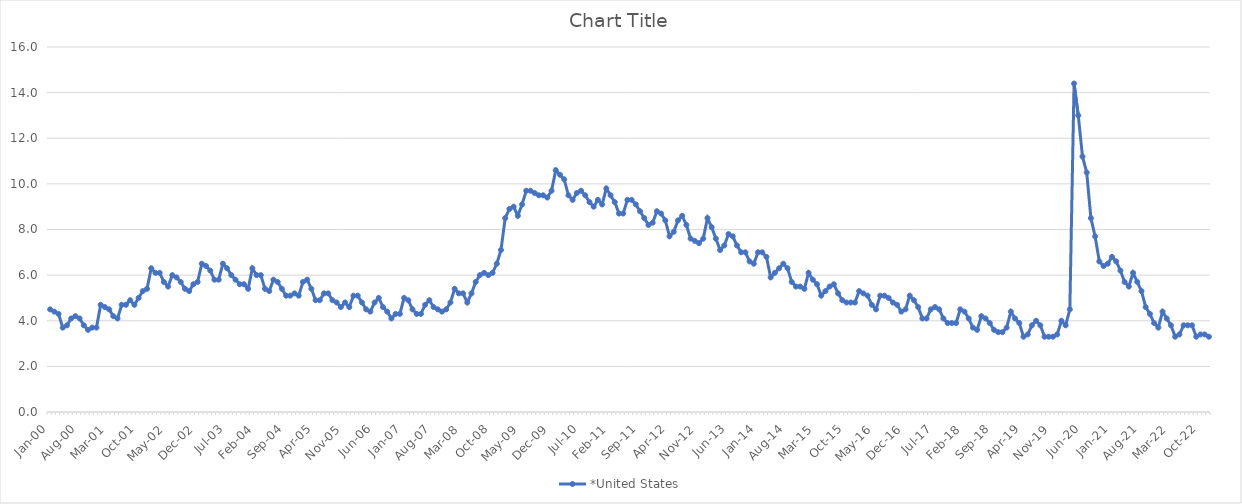
| Category | *United States | Alaska | Alabama | Arkansas | Arizona | California | Colorado | Connecticut | Delaware | Florida | Georgia | Hawaii | Iowa | Idaho | Illinois | Indiana | Kansas | Kentucky | Louisiana | Massachusetts | Maryland | Maine | Michigan | Minnesota | Missouri | Mississippi | Montana | North Carolina | North Dakota | Nebraska | New Hampshire | New Jersey | New Mexico | Nevada | New York | Ohio | Oklahoma | Oregon | Pennsylvania | Rhode Island | South Carolina | South Dakota | Tennessee | Texas | Utah | Virginia | Vermont | Washington | Wisconsin | West Virginia | Wyoming |
|---|---|---|---|---|---|---|---|---|---|---|---|---|---|---|---|---|---|---|---|---|---|---|---|---|---|---|---|---|---|---|---|---|---|---|---|---|---|---|---|---|---|---|---|---|---|---|---|---|---|---|---|
| Jan-00 | 4.5 |  |  |  |  |  |  |  |  |  |  |  |  |  |  |  |  |  |  |  |  |  |  |  |  |  |  |  |  |  |  |  |  |  |  |  |  |  |  |  |  |  |  |  |  |  |  |  |  |  |  |
| Feb-00 | 4.4 |  |  |  |  |  |  |  |  |  |  |  |  |  |  |  |  |  |  |  |  |  |  |  |  |  |  |  |  |  |  |  |  |  |  |  |  |  |  |  |  |  |  |  |  |  |  |  |  |  |  |
| Mar-00 | 4.3 |  |  |  |  |  |  |  |  |  |  |  |  |  |  |  |  |  |  |  |  |  |  |  |  |  |  |  |  |  |  |  |  |  |  |  |  |  |  |  |  |  |  |  |  |  |  |  |  |  |  |
| Apr-00 | 3.7 |  |  |  |  |  |  |  |  |  |  |  |  |  |  |  |  |  |  |  |  |  |  |  |  |  |  |  |  |  |  |  |  |  |  |  |  |  |  |  |  |  |  |  |  |  |  |  |  |  |  |
| May-00 | 3.8 |  |  |  |  |  |  |  |  |  |  |  |  |  |  |  |  |  |  |  |  |  |  |  |  |  |  |  |  |  |  |  |  |  |  |  |  |  |  |  |  |  |  |  |  |  |  |  |  |  |  |
| Jun-00 | 4.1 |  |  |  |  |  |  |  |  |  |  |  |  |  |  |  |  |  |  |  |  |  |  |  |  |  |  |  |  |  |  |  |  |  |  |  |  |  |  |  |  |  |  |  |  |  |  |  |  |  |  |
| Jul-00 | 4.2 |  |  |  |  |  |  |  |  |  |  |  |  |  |  |  |  |  |  |  |  |  |  |  |  |  |  |  |  |  |  |  |  |  |  |  |  |  |  |  |  |  |  |  |  |  |  |  |  |  |  |
| Aug-00 | 4.1 |  |  |  |  |  |  |  |  |  |  |  |  |  |  |  |  |  |  |  |  |  |  |  |  |  |  |  |  |  |  |  |  |  |  |  |  |  |  |  |  |  |  |  |  |  |  |  |  |  |  |
| Sep-00 | 3.8 |  |  |  |  |  |  |  |  |  |  |  |  |  |  |  |  |  |  |  |  |  |  |  |  |  |  |  |  |  |  |  |  |  |  |  |  |  |  |  |  |  |  |  |  |  |  |  |  |  |  |
| Oct-00 | 3.6 |  |  |  |  |  |  |  |  |  |  |  |  |  |  |  |  |  |  |  |  |  |  |  |  |  |  |  |  |  |  |  |  |  |  |  |  |  |  |  |  |  |  |  |  |  |  |  |  |  |  |
| Nov-00 | 3.7 |  |  |  |  |  |  |  |  |  |  |  |  |  |  |  |  |  |  |  |  |  |  |  |  |  |  |  |  |  |  |  |  |  |  |  |  |  |  |  |  |  |  |  |  |  |  |  |  |  |  |
| Dec-00 | 3.7 |  |  |  |  |  |  |  |  |  |  |  |  |  |  |  |  |  |  |  |  |  |  |  |  |  |  |  |  |  |  |  |  |  |  |  |  |  |  |  |  |  |  |  |  |  |  |  |  |  |  |
| Jan-01 | 4.7 |  |  |  |  |  |  |  |  |  |  |  |  |  |  |  |  |  |  |  |  |  |  |  |  |  |  |  |  |  |  |  |  |  |  |  |  |  |  |  |  |  |  |  |  |  |  |  |  |  |  |
| Feb-01 | 4.6 |  |  |  |  |  |  |  |  |  |  |  |  |  |  |  |  |  |  |  |  |  |  |  |  |  |  |  |  |  |  |  |  |  |  |  |  |  |  |  |  |  |  |  |  |  |  |  |  |  |  |
| Mar-01 | 4.5 |  |  |  |  |  |  |  |  |  |  |  |  |  |  |  |  |  |  |  |  |  |  |  |  |  |  |  |  |  |  |  |  |  |  |  |  |  |  |  |  |  |  |  |  |  |  |  |  |  |  |
| Apr-01 | 4.2 |  |  |  |  |  |  |  |  |  |  |  |  |  |  |  |  |  |  |  |  |  |  |  |  |  |  |  |  |  |  |  |  |  |  |  |  |  |  |  |  |  |  |  |  |  |  |  |  |  |  |
| May-01 | 4.1 |  |  |  |  |  |  |  |  |  |  |  |  |  |  |  |  |  |  |  |  |  |  |  |  |  |  |  |  |  |  |  |  |  |  |  |  |  |  |  |  |  |  |  |  |  |  |  |  |  |  |
| Jun-01 | 4.7 |  |  |  |  |  |  |  |  |  |  |  |  |  |  |  |  |  |  |  |  |  |  |  |  |  |  |  |  |  |  |  |  |  |  |  |  |  |  |  |  |  |  |  |  |  |  |  |  |  |  |
| Jul-01 | 4.7 |  |  |  |  |  |  |  |  |  |  |  |  |  |  |  |  |  |  |  |  |  |  |  |  |  |  |  |  |  |  |  |  |  |  |  |  |  |  |  |  |  |  |  |  |  |  |  |  |  |  |
| Aug-01 | 4.9 |  |  |  |  |  |  |  |  |  |  |  |  |  |  |  |  |  |  |  |  |  |  |  |  |  |  |  |  |  |  |  |  |  |  |  |  |  |  |  |  |  |  |  |  |  |  |  |  |  |  |
| Sep-01 | 4.7 |  |  |  |  |  |  |  |  |  |  |  |  |  |  |  |  |  |  |  |  |  |  |  |  |  |  |  |  |  |  |  |  |  |  |  |  |  |  |  |  |  |  |  |  |  |  |  |  |  |  |
| Oct-01 | 5 |  |  |  |  |  |  |  |  |  |  |  |  |  |  |  |  |  |  |  |  |  |  |  |  |  |  |  |  |  |  |  |  |  |  |  |  |  |  |  |  |  |  |  |  |  |  |  |  |  |  |
| Nov-01 | 5.3 |  |  |  |  |  |  |  |  |  |  |  |  |  |  |  |  |  |  |  |  |  |  |  |  |  |  |  |  |  |  |  |  |  |  |  |  |  |  |  |  |  |  |  |  |  |  |  |  |  |  |
| Dec-01 | 5.4 |  |  |  |  |  |  |  |  |  |  |  |  |  |  |  |  |  |  |  |  |  |  |  |  |  |  |  |  |  |  |  |  |  |  |  |  |  |  |  |  |  |  |  |  |  |  |  |  |  |  |
| Jan-02 | 6.3 |  |  |  |  |  |  |  |  |  |  |  |  |  |  |  |  |  |  |  |  |  |  |  |  |  |  |  |  |  |  |  |  |  |  |  |  |  |  |  |  |  |  |  |  |  |  |  |  |  |  |
| Feb-02 | 6.1 |  |  |  |  |  |  |  |  |  |  |  |  |  |  |  |  |  |  |  |  |  |  |  |  |  |  |  |  |  |  |  |  |  |  |  |  |  |  |  |  |  |  |  |  |  |  |  |  |  |  |
| Mar-02 | 6.1 |  |  |  |  |  |  |  |  |  |  |  |  |  |  |  |  |  |  |  |  |  |  |  |  |  |  |  |  |  |  |  |  |  |  |  |  |  |  |  |  |  |  |  |  |  |  |  |  |  |  |
| Apr-02 | 5.7 |  |  |  |  |  |  |  |  |  |  |  |  |  |  |  |  |  |  |  |  |  |  |  |  |  |  |  |  |  |  |  |  |  |  |  |  |  |  |  |  |  |  |  |  |  |  |  |  |  |  |
| May-02 | 5.5 |  |  |  |  |  |  |  |  |  |  |  |  |  |  |  |  |  |  |  |  |  |  |  |  |  |  |  |  |  |  |  |  |  |  |  |  |  |  |  |  |  |  |  |  |  |  |  |  |  |  |
| Jun-02 | 6 |  |  |  |  |  |  |  |  |  |  |  |  |  |  |  |  |  |  |  |  |  |  |  |  |  |  |  |  |  |  |  |  |  |  |  |  |  |  |  |  |  |  |  |  |  |  |  |  |  |  |
| Jul-02 | 5.9 |  |  |  |  |  |  |  |  |  |  |  |  |  |  |  |  |  |  |  |  |  |  |  |  |  |  |  |  |  |  |  |  |  |  |  |  |  |  |  |  |  |  |  |  |  |  |  |  |  |  |
| Aug-02 | 5.7 |  |  |  |  |  |  |  |  |  |  |  |  |  |  |  |  |  |  |  |  |  |  |  |  |  |  |  |  |  |  |  |  |  |  |  |  |  |  |  |  |  |  |  |  |  |  |  |  |  |  |
| Sep-02 | 5.4 |  |  |  |  |  |  |  |  |  |  |  |  |  |  |  |  |  |  |  |  |  |  |  |  |  |  |  |  |  |  |  |  |  |  |  |  |  |  |  |  |  |  |  |  |  |  |  |  |  |  |
| Oct-02 | 5.3 |  |  |  |  |  |  |  |  |  |  |  |  |  |  |  |  |  |  |  |  |  |  |  |  |  |  |  |  |  |  |  |  |  |  |  |  |  |  |  |  |  |  |  |  |  |  |  |  |  |  |
| Nov-02 | 5.6 |  |  |  |  |  |  |  |  |  |  |  |  |  |  |  |  |  |  |  |  |  |  |  |  |  |  |  |  |  |  |  |  |  |  |  |  |  |  |  |  |  |  |  |  |  |  |  |  |  |  |
| Dec-02 | 5.7 |  |  |  |  |  |  |  |  |  |  |  |  |  |  |  |  |  |  |  |  |  |  |  |  |  |  |  |  |  |  |  |  |  |  |  |  |  |  |  |  |  |  |  |  |  |  |  |  |  |  |
| Jan-03 | 6.5 |  |  |  |  |  |  |  |  |  |  |  |  |  |  |  |  |  |  |  |  |  |  |  |  |  |  |  |  |  |  |  |  |  |  |  |  |  |  |  |  |  |  |  |  |  |  |  |  |  |  |
| Feb-03 | 6.4 |  |  |  |  |  |  |  |  |  |  |  |  |  |  |  |  |  |  |  |  |  |  |  |  |  |  |  |  |  |  |  |  |  |  |  |  |  |  |  |  |  |  |  |  |  |  |  |  |  |  |
| Mar-03 | 6.2 |  |  |  |  |  |  |  |  |  |  |  |  |  |  |  |  |  |  |  |  |  |  |  |  |  |  |  |  |  |  |  |  |  |  |  |  |  |  |  |  |  |  |  |  |  |  |  |  |  |  |
| Apr-03 | 5.8 |  |  |  |  |  |  |  |  |  |  |  |  |  |  |  |  |  |  |  |  |  |  |  |  |  |  |  |  |  |  |  |  |  |  |  |  |  |  |  |  |  |  |  |  |  |  |  |  |  |  |
| May-03 | 5.8 |  |  |  |  |  |  |  |  |  |  |  |  |  |  |  |  |  |  |  |  |  |  |  |  |  |  |  |  |  |  |  |  |  |  |  |  |  |  |  |  |  |  |  |  |  |  |  |  |  |  |
| Jun-03 | 6.5 |  |  |  |  |  |  |  |  |  |  |  |  |  |  |  |  |  |  |  |  |  |  |  |  |  |  |  |  |  |  |  |  |  |  |  |  |  |  |  |  |  |  |  |  |  |  |  |  |  |  |
| Jul-03 | 6.3 |  |  |  |  |  |  |  |  |  |  |  |  |  |  |  |  |  |  |  |  |  |  |  |  |  |  |  |  |  |  |  |  |  |  |  |  |  |  |  |  |  |  |  |  |  |  |  |  |  |  |
| Aug-03 | 6 |  |  |  |  |  |  |  |  |  |  |  |  |  |  |  |  |  |  |  |  |  |  |  |  |  |  |  |  |  |  |  |  |  |  |  |  |  |  |  |  |  |  |  |  |  |  |  |  |  |  |
| Sep-03 | 5.8 |  |  |  |  |  |  |  |  |  |  |  |  |  |  |  |  |  |  |  |  |  |  |  |  |  |  |  |  |  |  |  |  |  |  |  |  |  |  |  |  |  |  |  |  |  |  |  |  |  |  |
| Oct-03 | 5.6 |  |  |  |  |  |  |  |  |  |  |  |  |  |  |  |  |  |  |  |  |  |  |  |  |  |  |  |  |  |  |  |  |  |  |  |  |  |  |  |  |  |  |  |  |  |  |  |  |  |  |
| Nov-03 | 5.6 |  |  |  |  |  |  |  |  |  |  |  |  |  |  |  |  |  |  |  |  |  |  |  |  |  |  |  |  |  |  |  |  |  |  |  |  |  |  |  |  |  |  |  |  |  |  |  |  |  |  |
| Dec-03 | 5.4 |  |  |  |  |  |  |  |  |  |  |  |  |  |  |  |  |  |  |  |  |  |  |  |  |  |  |  |  |  |  |  |  |  |  |  |  |  |  |  |  |  |  |  |  |  |  |  |  |  |  |
| Jan-04 | 6.3 |  |  |  |  |  |  |  |  |  |  |  |  |  |  |  |  |  |  |  |  |  |  |  |  |  |  |  |  |  |  |  |  |  |  |  |  |  |  |  |  |  |  |  |  |  |  |  |  |  |  |
| Feb-04 | 6 |  |  |  |  |  |  |  |  |  |  |  |  |  |  |  |  |  |  |  |  |  |  |  |  |  |  |  |  |  |  |  |  |  |  |  |  |  |  |  |  |  |  |  |  |  |  |  |  |  |  |
| Mar-04 | 6 |  |  |  |  |  |  |  |  |  |  |  |  |  |  |  |  |  |  |  |  |  |  |  |  |  |  |  |  |  |  |  |  |  |  |  |  |  |  |  |  |  |  |  |  |  |  |  |  |  |  |
| Apr-04 | 5.4 |  |  |  |  |  |  |  |  |  |  |  |  |  |  |  |  |  |  |  |  |  |  |  |  |  |  |  |  |  |  |  |  |  |  |  |  |  |  |  |  |  |  |  |  |  |  |  |  |  |  |
| May-04 | 5.3 |  |  |  |  |  |  |  |  |  |  |  |  |  |  |  |  |  |  |  |  |  |  |  |  |  |  |  |  |  |  |  |  |  |  |  |  |  |  |  |  |  |  |  |  |  |  |  |  |  |  |
| Jun-04 | 5.8 |  |  |  |  |  |  |  |  |  |  |  |  |  |  |  |  |  |  |  |  |  |  |  |  |  |  |  |  |  |  |  |  |  |  |  |  |  |  |  |  |  |  |  |  |  |  |  |  |  |  |
| Jul-04 | 5.7 |  |  |  |  |  |  |  |  |  |  |  |  |  |  |  |  |  |  |  |  |  |  |  |  |  |  |  |  |  |  |  |  |  |  |  |  |  |  |  |  |  |  |  |  |  |  |  |  |  |  |
| Aug-04 | 5.4 |  |  |  |  |  |  |  |  |  |  |  |  |  |  |  |  |  |  |  |  |  |  |  |  |  |  |  |  |  |  |  |  |  |  |  |  |  |  |  |  |  |  |  |  |  |  |  |  |  |  |
| Sep-04 | 5.1 |  |  |  |  |  |  |  |  |  |  |  |  |  |  |  |  |  |  |  |  |  |  |  |  |  |  |  |  |  |  |  |  |  |  |  |  |  |  |  |  |  |  |  |  |  |  |  |  |  |  |
| Oct-04 | 5.1 |  |  |  |  |  |  |  |  |  |  |  |  |  |  |  |  |  |  |  |  |  |  |  |  |  |  |  |  |  |  |  |  |  |  |  |  |  |  |  |  |  |  |  |  |  |  |  |  |  |  |
| Nov-04 | 5.2 |  |  |  |  |  |  |  |  |  |  |  |  |  |  |  |  |  |  |  |  |  |  |  |  |  |  |  |  |  |  |  |  |  |  |  |  |  |  |  |  |  |  |  |  |  |  |  |  |  |  |
| Dec-04 | 5.1 |  |  |  |  |  |  |  |  |  |  |  |  |  |  |  |  |  |  |  |  |  |  |  |  |  |  |  |  |  |  |  |  |  |  |  |  |  |  |  |  |  |  |  |  |  |  |  |  |  |  |
| Jan-05 | 5.7 |  |  |  |  |  |  |  |  |  |  |  |  |  |  |  |  |  |  |  |  |  |  |  |  |  |  |  |  |  |  |  |  |  |  |  |  |  |  |  |  |  |  |  |  |  |  |  |  |  |  |
| Feb-05 | 5.8 |  |  |  |  |  |  |  |  |  |  |  |  |  |  |  |  |  |  |  |  |  |  |  |  |  |  |  |  |  |  |  |  |  |  |  |  |  |  |  |  |  |  |  |  |  |  |  |  |  |  |
| Mar-05 | 5.4 |  |  |  |  |  |  |  |  |  |  |  |  |  |  |  |  |  |  |  |  |  |  |  |  |  |  |  |  |  |  |  |  |  |  |  |  |  |  |  |  |  |  |  |  |  |  |  |  |  |  |
| Apr-05 | 4.9 |  |  |  |  |  |  |  |  |  |  |  |  |  |  |  |  |  |  |  |  |  |  |  |  |  |  |  |  |  |  |  |  |  |  |  |  |  |  |  |  |  |  |  |  |  |  |  |  |  |  |
| May-05 | 4.9 |  |  |  |  |  |  |  |  |  |  |  |  |  |  |  |  |  |  |  |  |  |  |  |  |  |  |  |  |  |  |  |  |  |  |  |  |  |  |  |  |  |  |  |  |  |  |  |  |  |  |
| Jun-05 | 5.2 |  |  |  |  |  |  |  |  |  |  |  |  |  |  |  |  |  |  |  |  |  |  |  |  |  |  |  |  |  |  |  |  |  |  |  |  |  |  |  |  |  |  |  |  |  |  |  |  |  |  |
| Jul-05 | 5.2 |  |  |  |  |  |  |  |  |  |  |  |  |  |  |  |  |  |  |  |  |  |  |  |  |  |  |  |  |  |  |  |  |  |  |  |  |  |  |  |  |  |  |  |  |  |  |  |  |  |  |
| Aug-05 | 4.9 |  |  |  |  |  |  |  |  |  |  |  |  |  |  |  |  |  |  |  |  |  |  |  |  |  |  |  |  |  |  |  |  |  |  |  |  |  |  |  |  |  |  |  |  |  |  |  |  |  |  |
| Sep-05 | 4.8 |  |  |  |  |  |  |  |  |  |  |  |  |  |  |  |  |  |  |  |  |  |  |  |  |  |  |  |  |  |  |  |  |  |  |  |  |  |  |  |  |  |  |  |  |  |  |  |  |  |  |
| Oct-05 | 4.6 |  |  |  |  |  |  |  |  |  |  |  |  |  |  |  |  |  |  |  |  |  |  |  |  |  |  |  |  |  |  |  |  |  |  |  |  |  |  |  |  |  |  |  |  |  |  |  |  |  |  |
| Nov-05 | 4.8 |  |  |  |  |  |  |  |  |  |  |  |  |  |  |  |  |  |  |  |  |  |  |  |  |  |  |  |  |  |  |  |  |  |  |  |  |  |  |  |  |  |  |  |  |  |  |  |  |  |  |
| Dec-05 | 4.6 |  |  |  |  |  |  |  |  |  |  |  |  |  |  |  |  |  |  |  |  |  |  |  |  |  |  |  |  |  |  |  |  |  |  |  |  |  |  |  |  |  |  |  |  |  |  |  |  |  |  |
| Jan-06 | 5.1 |  |  |  |  |  |  |  |  |  |  |  |  |  |  |  |  |  |  |  |  |  |  |  |  |  |  |  |  |  |  |  |  |  |  |  |  |  |  |  |  |  |  |  |  |  |  |  |  |  |  |
| Feb-06 | 5.1 |  |  |  |  |  |  |  |  |  |  |  |  |  |  |  |  |  |  |  |  |  |  |  |  |  |  |  |  |  |  |  |  |  |  |  |  |  |  |  |  |  |  |  |  |  |  |  |  |  |  |
| Mar-06 | 4.8 |  |  |  |  |  |  |  |  |  |  |  |  |  |  |  |  |  |  |  |  |  |  |  |  |  |  |  |  |  |  |  |  |  |  |  |  |  |  |  |  |  |  |  |  |  |  |  |  |  |  |
| Apr-06 | 4.5 |  |  |  |  |  |  |  |  |  |  |  |  |  |  |  |  |  |  |  |  |  |  |  |  |  |  |  |  |  |  |  |  |  |  |  |  |  |  |  |  |  |  |  |  |  |  |  |  |  |  |
| May-06 | 4.4 |  |  |  |  |  |  |  |  |  |  |  |  |  |  |  |  |  |  |  |  |  |  |  |  |  |  |  |  |  |  |  |  |  |  |  |  |  |  |  |  |  |  |  |  |  |  |  |  |  |  |
| Jun-06 | 4.8 |  |  |  |  |  |  |  |  |  |  |  |  |  |  |  |  |  |  |  |  |  |  |  |  |  |  |  |  |  |  |  |  |  |  |  |  |  |  |  |  |  |  |  |  |  |  |  |  |  |  |
| Jul-06 | 5 |  |  |  |  |  |  |  |  |  |  |  |  |  |  |  |  |  |  |  |  |  |  |  |  |  |  |  |  |  |  |  |  |  |  |  |  |  |  |  |  |  |  |  |  |  |  |  |  |  |  |
| Aug-06 | 4.6 |  |  |  |  |  |  |  |  |  |  |  |  |  |  |  |  |  |  |  |  |  |  |  |  |  |  |  |  |  |  |  |  |  |  |  |  |  |  |  |  |  |  |  |  |  |  |  |  |  |  |
| Sep-06 | 4.4 |  |  |  |  |  |  |  |  |  |  |  |  |  |  |  |  |  |  |  |  |  |  |  |  |  |  |  |  |  |  |  |  |  |  |  |  |  |  |  |  |  |  |  |  |  |  |  |  |  |  |
| Oct-06 | 4.1 |  |  |  |  |  |  |  |  |  |  |  |  |  |  |  |  |  |  |  |  |  |  |  |  |  |  |  |  |  |  |  |  |  |  |  |  |  |  |  |  |  |  |  |  |  |  |  |  |  |  |
| Nov-06 | 4.3 |  |  |  |  |  |  |  |  |  |  |  |  |  |  |  |  |  |  |  |  |  |  |  |  |  |  |  |  |  |  |  |  |  |  |  |  |  |  |  |  |  |  |  |  |  |  |  |  |  |  |
| Dec-06 | 4.3 |  |  |  |  |  |  |  |  |  |  |  |  |  |  |  |  |  |  |  |  |  |  |  |  |  |  |  |  |  |  |  |  |  |  |  |  |  |  |  |  |  |  |  |  |  |  |  |  |  |  |
| Jan-07 | 5 |  |  |  |  |  |  |  |  |  |  |  |  |  |  |  |  |  |  |  |  |  |  |  |  |  |  |  |  |  |  |  |  |  |  |  |  |  |  |  |  |  |  |  |  |  |  |  |  |  |  |
| Feb-07 | 4.9 |  |  |  |  |  |  |  |  |  |  |  |  |  |  |  |  |  |  |  |  |  |  |  |  |  |  |  |  |  |  |  |  |  |  |  |  |  |  |  |  |  |  |  |  |  |  |  |  |  |  |
| Mar-07 | 4.5 |  |  |  |  |  |  |  |  |  |  |  |  |  |  |  |  |  |  |  |  |  |  |  |  |  |  |  |  |  |  |  |  |  |  |  |  |  |  |  |  |  |  |  |  |  |  |  |  |  |  |
| Apr-07 | 4.3 |  |  |  |  |  |  |  |  |  |  |  |  |  |  |  |  |  |  |  |  |  |  |  |  |  |  |  |  |  |  |  |  |  |  |  |  |  |  |  |  |  |  |  |  |  |  |  |  |  |  |
| May-07 | 4.3 |  |  |  |  |  |  |  |  |  |  |  |  |  |  |  |  |  |  |  |  |  |  |  |  |  |  |  |  |  |  |  |  |  |  |  |  |  |  |  |  |  |  |  |  |  |  |  |  |  |  |
| Jun-07 | 4.7 |  |  |  |  |  |  |  |  |  |  |  |  |  |  |  |  |  |  |  |  |  |  |  |  |  |  |  |  |  |  |  |  |  |  |  |  |  |  |  |  |  |  |  |  |  |  |  |  |  |  |
| Jul-07 | 4.9 |  |  |  |  |  |  |  |  |  |  |  |  |  |  |  |  |  |  |  |  |  |  |  |  |  |  |  |  |  |  |  |  |  |  |  |  |  |  |  |  |  |  |  |  |  |  |  |  |  |  |
| Aug-07 | 4.6 |  |  |  |  |  |  |  |  |  |  |  |  |  |  |  |  |  |  |  |  |  |  |  |  |  |  |  |  |  |  |  |  |  |  |  |  |  |  |  |  |  |  |  |  |  |  |  |  |  |  |
| Sep-07 | 4.5 |  |  |  |  |  |  |  |  |  |  |  |  |  |  |  |  |  |  |  |  |  |  |  |  |  |  |  |  |  |  |  |  |  |  |  |  |  |  |  |  |  |  |  |  |  |  |  |  |  |  |
| Oct-07 | 4.4 |  |  |  |  |  |  |  |  |  |  |  |  |  |  |  |  |  |  |  |  |  |  |  |  |  |  |  |  |  |  |  |  |  |  |  |  |  |  |  |  |  |  |  |  |  |  |  |  |  |  |
| Nov-07 | 4.5 |  |  |  |  |  |  |  |  |  |  |  |  |  |  |  |  |  |  |  |  |  |  |  |  |  |  |  |  |  |  |  |  |  |  |  |  |  |  |  |  |  |  |  |  |  |  |  |  |  |  |
| Dec-07 | 4.8 |  |  |  |  |  |  |  |  |  |  |  |  |  |  |  |  |  |  |  |  |  |  |  |  |  |  |  |  |  |  |  |  |  |  |  |  |  |  |  |  |  |  |  |  |  |  |  |  |  |  |
| Jan-08 | 5.4 |  |  |  |  |  |  |  |  |  |  |  |  |  |  |  |  |  |  |  |  |  |  |  |  |  |  |  |  |  |  |  |  |  |  |  |  |  |  |  |  |  |  |  |  |  |  |  |  |  |  |
| Feb-08 | 5.2 |  |  |  |  |  |  |  |  |  |  |  |  |  |  |  |  |  |  |  |  |  |  |  |  |  |  |  |  |  |  |  |  |  |  |  |  |  |  |  |  |  |  |  |  |  |  |  |  |  |  |
| Mar-08 | 5.2 |  |  |  |  |  |  |  |  |  |  |  |  |  |  |  |  |  |  |  |  |  |  |  |  |  |  |  |  |  |  |  |  |  |  |  |  |  |  |  |  |  |  |  |  |  |  |  |  |  |  |
| Apr-08 | 4.8 |  |  |  |  |  |  |  |  |  |  |  |  |  |  |  |  |  |  |  |  |  |  |  |  |  |  |  |  |  |  |  |  |  |  |  |  |  |  |  |  |  |  |  |  |  |  |  |  |  |  |
| May-08 | 5.2 |  |  |  |  |  |  |  |  |  |  |  |  |  |  |  |  |  |  |  |  |  |  |  |  |  |  |  |  |  |  |  |  |  |  |  |  |  |  |  |  |  |  |  |  |  |  |  |  |  |  |
| Jun-08 | 5.7 |  |  |  |  |  |  |  |  |  |  |  |  |  |  |  |  |  |  |  |  |  |  |  |  |  |  |  |  |  |  |  |  |  |  |  |  |  |  |  |  |  |  |  |  |  |  |  |  |  |  |
| Jul-08 | 6 |  |  |  |  |  |  |  |  |  |  |  |  |  |  |  |  |  |  |  |  |  |  |  |  |  |  |  |  |  |  |  |  |  |  |  |  |  |  |  |  |  |  |  |  |  |  |  |  |  |  |
| Aug-08 | 6.1 |  |  |  |  |  |  |  |  |  |  |  |  |  |  |  |  |  |  |  |  |  |  |  |  |  |  |  |  |  |  |  |  |  |  |  |  |  |  |  |  |  |  |  |  |  |  |  |  |  |  |
| Sep-08 | 6 |  |  |  |  |  |  |  |  |  |  |  |  |  |  |  |  |  |  |  |  |  |  |  |  |  |  |  |  |  |  |  |  |  |  |  |  |  |  |  |  |  |  |  |  |  |  |  |  |  |  |
| Oct-08 | 6.1 |  |  |  |  |  |  |  |  |  |  |  |  |  |  |  |  |  |  |  |  |  |  |  |  |  |  |  |  |  |  |  |  |  |  |  |  |  |  |  |  |  |  |  |  |  |  |  |  |  |  |
| Nov-08 | 6.5 |  |  |  |  |  |  |  |  |  |  |  |  |  |  |  |  |  |  |  |  |  |  |  |  |  |  |  |  |  |  |  |  |  |  |  |  |  |  |  |  |  |  |  |  |  |  |  |  |  |  |
| Dec-08 | 7.1 |  |  |  |  |  |  |  |  |  |  |  |  |  |  |  |  |  |  |  |  |  |  |  |  |  |  |  |  |  |  |  |  |  |  |  |  |  |  |  |  |  |  |  |  |  |  |  |  |  |  |
| Jan-09 | 8.5 |  |  |  |  |  |  |  |  |  |  |  |  |  |  |  |  |  |  |  |  |  |  |  |  |  |  |  |  |  |  |  |  |  |  |  |  |  |  |  |  |  |  |  |  |  |  |  |  |  |  |
| Feb-09 | 8.9 |  |  |  |  |  |  |  |  |  |  |  |  |  |  |  |  |  |  |  |  |  |  |  |  |  |  |  |  |  |  |  |  |  |  |  |  |  |  |  |  |  |  |  |  |  |  |  |  |  |  |
| Mar-09 | 9 |  |  |  |  |  |  |  |  |  |  |  |  |  |  |  |  |  |  |  |  |  |  |  |  |  |  |  |  |  |  |  |  |  |  |  |  |  |  |  |  |  |  |  |  |  |  |  |  |  |  |
| Apr-09 | 8.6 |  |  |  |  |  |  |  |  |  |  |  |  |  |  |  |  |  |  |  |  |  |  |  |  |  |  |  |  |  |  |  |  |  |  |  |  |  |  |  |  |  |  |  |  |  |  |  |  |  |  |
| May-09 | 9.1 |  |  |  |  |  |  |  |  |  |  |  |  |  |  |  |  |  |  |  |  |  |  |  |  |  |  |  |  |  |  |  |  |  |  |  |  |  |  |  |  |  |  |  |  |  |  |  |  |  |  |
| Jun-09 | 9.7 |  |  |  |  |  |  |  |  |  |  |  |  |  |  |  |  |  |  |  |  |  |  |  |  |  |  |  |  |  |  |  |  |  |  |  |  |  |  |  |  |  |  |  |  |  |  |  |  |  |  |
| Jul-09 | 9.7 |  |  |  |  |  |  |  |  |  |  |  |  |  |  |  |  |  |  |  |  |  |  |  |  |  |  |  |  |  |  |  |  |  |  |  |  |  |  |  |  |  |  |  |  |  |  |  |  |  |  |
| Aug-09 | 9.6 |  |  |  |  |  |  |  |  |  |  |  |  |  |  |  |  |  |  |  |  |  |  |  |  |  |  |  |  |  |  |  |  |  |  |  |  |  |  |  |  |  |  |  |  |  |  |  |  |  |  |
| Sep-09 | 9.5 |  |  |  |  |  |  |  |  |  |  |  |  |  |  |  |  |  |  |  |  |  |  |  |  |  |  |  |  |  |  |  |  |  |  |  |  |  |  |  |  |  |  |  |  |  |  |  |  |  |  |
| Oct-09 | 9.5 |  |  |  |  |  |  |  |  |  |  |  |  |  |  |  |  |  |  |  |  |  |  |  |  |  |  |  |  |  |  |  |  |  |  |  |  |  |  |  |  |  |  |  |  |  |  |  |  |  |  |
| Nov-09 | 9.4 |  |  |  |  |  |  |  |  |  |  |  |  |  |  |  |  |  |  |  |  |  |  |  |  |  |  |  |  |  |  |  |  |  |  |  |  |  |  |  |  |  |  |  |  |  |  |  |  |  |  |
| Dec-09 | 9.7 |  |  |  |  |  |  |  |  |  |  |  |  |  |  |  |  |  |  |  |  |  |  |  |  |  |  |  |  |  |  |  |  |  |  |  |  |  |  |  |  |  |  |  |  |  |  |  |  |  |  |
| Jan-10 | 10.6 |  |  |  |  |  |  |  |  |  |  |  |  |  |  |  |  |  |  |  |  |  |  |  |  |  |  |  |  |  |  |  |  |  |  |  |  |  |  |  |  |  |  |  |  |  |  |  |  |  |  |
| Feb-10 | 10.4 |  |  |  |  |  |  |  |  |  |  |  |  |  |  |  |  |  |  |  |  |  |  |  |  |  |  |  |  |  |  |  |  |  |  |  |  |  |  |  |  |  |  |  |  |  |  |  |  |  |  |
| Mar-10 | 10.2 |  |  |  |  |  |  |  |  |  |  |  |  |  |  |  |  |  |  |  |  |  |  |  |  |  |  |  |  |  |  |  |  |  |  |  |  |  |  |  |  |  |  |  |  |  |  |  |  |  |  |
| Apr-10 | 9.5 |  |  |  |  |  |  |  |  |  |  |  |  |  |  |  |  |  |  |  |  |  |  |  |  |  |  |  |  |  |  |  |  |  |  |  |  |  |  |  |  |  |  |  |  |  |  |  |  |  |  |
| May-10 | 9.3 |  |  |  |  |  |  |  |  |  |  |  |  |  |  |  |  |  |  |  |  |  |  |  |  |  |  |  |  |  |  |  |  |  |  |  |  |  |  |  |  |  |  |  |  |  |  |  |  |  |  |
| Jun-10 | 9.6 |  |  |  |  |  |  |  |  |  |  |  |  |  |  |  |  |  |  |  |  |  |  |  |  |  |  |  |  |  |  |  |  |  |  |  |  |  |  |  |  |  |  |  |  |  |  |  |  |  |  |
| Jul-10 | 9.7 |  |  |  |  |  |  |  |  |  |  |  |  |  |  |  |  |  |  |  |  |  |  |  |  |  |  |  |  |  |  |  |  |  |  |  |  |  |  |  |  |  |  |  |  |  |  |  |  |  |  |
| Aug-10 | 9.5 |  |  |  |  |  |  |  |  |  |  |  |  |  |  |  |  |  |  |  |  |  |  |  |  |  |  |  |  |  |  |  |  |  |  |  |  |  |  |  |  |  |  |  |  |  |  |  |  |  |  |
| Sep-10 | 9.2 |  |  |  |  |  |  |  |  |  |  |  |  |  |  |  |  |  |  |  |  |  |  |  |  |  |  |  |  |  |  |  |  |  |  |  |  |  |  |  |  |  |  |  |  |  |  |  |  |  |  |
| Oct-10 | 9 |  |  |  |  |  |  |  |  |  |  |  |  |  |  |  |  |  |  |  |  |  |  |  |  |  |  |  |  |  |  |  |  |  |  |  |  |  |  |  |  |  |  |  |  |  |  |  |  |  |  |
| Nov-10 | 9.3 |  |  |  |  |  |  |  |  |  |  |  |  |  |  |  |  |  |  |  |  |  |  |  |  |  |  |  |  |  |  |  |  |  |  |  |  |  |  |  |  |  |  |  |  |  |  |  |  |  |  |
| Dec-10 | 9.1 |  |  |  |  |  |  |  |  |  |  |  |  |  |  |  |  |  |  |  |  |  |  |  |  |  |  |  |  |  |  |  |  |  |  |  |  |  |  |  |  |  |  |  |  |  |  |  |  |  |  |
| Jan-11 | 9.8 |  |  |  |  |  |  |  |  |  |  |  |  |  |  |  |  |  |  |  |  |  |  |  |  |  |  |  |  |  |  |  |  |  |  |  |  |  |  |  |  |  |  |  |  |  |  |  |  |  |  |
| Feb-11 | 9.5 |  |  |  |  |  |  |  |  |  |  |  |  |  |  |  |  |  |  |  |  |  |  |  |  |  |  |  |  |  |  |  |  |  |  |  |  |  |  |  |  |  |  |  |  |  |  |  |  |  |  |
| Mar-11 | 9.2 |  |  |  |  |  |  |  |  |  |  |  |  |  |  |  |  |  |  |  |  |  |  |  |  |  |  |  |  |  |  |  |  |  |  |  |  |  |  |  |  |  |  |  |  |  |  |  |  |  |  |
| Apr-11 | 8.7 |  |  |  |  |  |  |  |  |  |  |  |  |  |  |  |  |  |  |  |  |  |  |  |  |  |  |  |  |  |  |  |  |  |  |  |  |  |  |  |  |  |  |  |  |  |  |  |  |  |  |
| May-11 | 8.7 |  |  |  |  |  |  |  |  |  |  |  |  |  |  |  |  |  |  |  |  |  |  |  |  |  |  |  |  |  |  |  |  |  |  |  |  |  |  |  |  |  |  |  |  |  |  |  |  |  |  |
| Jun-11 | 9.3 |  |  |  |  |  |  |  |  |  |  |  |  |  |  |  |  |  |  |  |  |  |  |  |  |  |  |  |  |  |  |  |  |  |  |  |  |  |  |  |  |  |  |  |  |  |  |  |  |  |  |
| Jul-11 | 9.3 |  |  |  |  |  |  |  |  |  |  |  |  |  |  |  |  |  |  |  |  |  |  |  |  |  |  |  |  |  |  |  |  |  |  |  |  |  |  |  |  |  |  |  |  |  |  |  |  |  |  |
| Aug-11 | 9.1 |  |  |  |  |  |  |  |  |  |  |  |  |  |  |  |  |  |  |  |  |  |  |  |  |  |  |  |  |  |  |  |  |  |  |  |  |  |  |  |  |  |  |  |  |  |  |  |  |  |  |
| Sep-11 | 8.8 |  |  |  |  |  |  |  |  |  |  |  |  |  |  |  |  |  |  |  |  |  |  |  |  |  |  |  |  |  |  |  |  |  |  |  |  |  |  |  |  |  |  |  |  |  |  |  |  |  |  |
| Oct-11 | 8.5 |  |  |  |  |  |  |  |  |  |  |  |  |  |  |  |  |  |  |  |  |  |  |  |  |  |  |  |  |  |  |  |  |  |  |  |  |  |  |  |  |  |  |  |  |  |  |  |  |  |  |
| Nov-11 | 8.2 |  |  |  |  |  |  |  |  |  |  |  |  |  |  |  |  |  |  |  |  |  |  |  |  |  |  |  |  |  |  |  |  |  |  |  |  |  |  |  |  |  |  |  |  |  |  |  |  |  |  |
| Dec-11 | 8.3 |  |  |  |  |  |  |  |  |  |  |  |  |  |  |  |  |  |  |  |  |  |  |  |  |  |  |  |  |  |  |  |  |  |  |  |  |  |  |  |  |  |  |  |  |  |  |  |  |  |  |
| Jan-12 | 8.8 |  |  |  |  |  |  |  |  |  |  |  |  |  |  |  |  |  |  |  |  |  |  |  |  |  |  |  |  |  |  |  |  |  |  |  |  |  |  |  |  |  |  |  |  |  |  |  |  |  |  |
| Feb-12 | 8.7 |  |  |  |  |  |  |  |  |  |  |  |  |  |  |  |  |  |  |  |  |  |  |  |  |  |  |  |  |  |  |  |  |  |  |  |  |  |  |  |  |  |  |  |  |  |  |  |  |  |  |
| Mar-12 | 8.4 |  |  |  |  |  |  |  |  |  |  |  |  |  |  |  |  |  |  |  |  |  |  |  |  |  |  |  |  |  |  |  |  |  |  |  |  |  |  |  |  |  |  |  |  |  |  |  |  |  |  |
| Apr-12 | 7.7 |  |  |  |  |  |  |  |  |  |  |  |  |  |  |  |  |  |  |  |  |  |  |  |  |  |  |  |  |  |  |  |  |  |  |  |  |  |  |  |  |  |  |  |  |  |  |  |  |  |  |
| May-12 | 7.9 |  |  |  |  |  |  |  |  |  |  |  |  |  |  |  |  |  |  |  |  |  |  |  |  |  |  |  |  |  |  |  |  |  |  |  |  |  |  |  |  |  |  |  |  |  |  |  |  |  |  |
| Jun-12 | 8.4 |  |  |  |  |  |  |  |  |  |  |  |  |  |  |  |  |  |  |  |  |  |  |  |  |  |  |  |  |  |  |  |  |  |  |  |  |  |  |  |  |  |  |  |  |  |  |  |  |  |  |
| Jul-12 | 8.6 |  |  |  |  |  |  |  |  |  |  |  |  |  |  |  |  |  |  |  |  |  |  |  |  |  |  |  |  |  |  |  |  |  |  |  |  |  |  |  |  |  |  |  |  |  |  |  |  |  |  |
| Aug-12 | 8.2 |  |  |  |  |  |  |  |  |  |  |  |  |  |  |  |  |  |  |  |  |  |  |  |  |  |  |  |  |  |  |  |  |  |  |  |  |  |  |  |  |  |  |  |  |  |  |  |  |  |  |
| Sep-12 | 7.6 |  |  |  |  |  |  |  |  |  |  |  |  |  |  |  |  |  |  |  |  |  |  |  |  |  |  |  |  |  |  |  |  |  |  |  |  |  |  |  |  |  |  |  |  |  |  |  |  |  |  |
| Oct-12 | 7.5 |  |  |  |  |  |  |  |  |  |  |  |  |  |  |  |  |  |  |  |  |  |  |  |  |  |  |  |  |  |  |  |  |  |  |  |  |  |  |  |  |  |  |  |  |  |  |  |  |  |  |
| Nov-12 | 7.4 |  |  |  |  |  |  |  |  |  |  |  |  |  |  |  |  |  |  |  |  |  |  |  |  |  |  |  |  |  |  |  |  |  |  |  |  |  |  |  |  |  |  |  |  |  |  |  |  |  |  |
| Dec-12 | 7.6 |  |  |  |  |  |  |  |  |  |  |  |  |  |  |  |  |  |  |  |  |  |  |  |  |  |  |  |  |  |  |  |  |  |  |  |  |  |  |  |  |  |  |  |  |  |  |  |  |  |  |
| Jan-13 | 8.5 |  |  |  |  |  |  |  |  |  |  |  |  |  |  |  |  |  |  |  |  |  |  |  |  |  |  |  |  |  |  |  |  |  |  |  |  |  |  |  |  |  |  |  |  |  |  |  |  |  |  |
| Feb-13 | 8.1 |  |  |  |  |  |  |  |  |  |  |  |  |  |  |  |  |  |  |  |  |  |  |  |  |  |  |  |  |  |  |  |  |  |  |  |  |  |  |  |  |  |  |  |  |  |  |  |  |  |  |
| Mar-13 | 7.6 |  |  |  |  |  |  |  |  |  |  |  |  |  |  |  |  |  |  |  |  |  |  |  |  |  |  |  |  |  |  |  |  |  |  |  |  |  |  |  |  |  |  |  |  |  |  |  |  |  |  |
| Apr-13 | 7.1 |  |  |  |  |  |  |  |  |  |  |  |  |  |  |  |  |  |  |  |  |  |  |  |  |  |  |  |  |  |  |  |  |  |  |  |  |  |  |  |  |  |  |  |  |  |  |  |  |  |  |
| May-13 | 7.3 |  |  |  |  |  |  |  |  |  |  |  |  |  |  |  |  |  |  |  |  |  |  |  |  |  |  |  |  |  |  |  |  |  |  |  |  |  |  |  |  |  |  |  |  |  |  |  |  |  |  |
| Jun-13 | 7.8 |  |  |  |  |  |  |  |  |  |  |  |  |  |  |  |  |  |  |  |  |  |  |  |  |  |  |  |  |  |  |  |  |  |  |  |  |  |  |  |  |  |  |  |  |  |  |  |  |  |  |
| Jul-13 | 7.7 |  |  |  |  |  |  |  |  |  |  |  |  |  |  |  |  |  |  |  |  |  |  |  |  |  |  |  |  |  |  |  |  |  |  |  |  |  |  |  |  |  |  |  |  |  |  |  |  |  |  |
| Aug-13 | 7.3 |  |  |  |  |  |  |  |  |  |  |  |  |  |  |  |  |  |  |  |  |  |  |  |  |  |  |  |  |  |  |  |  |  |  |  |  |  |  |  |  |  |  |  |  |  |  |  |  |  |  |
| Sep-13 | 7 |  |  |  |  |  |  |  |  |  |  |  |  |  |  |  |  |  |  |  |  |  |  |  |  |  |  |  |  |  |  |  |  |  |  |  |  |  |  |  |  |  |  |  |  |  |  |  |  |  |  |
| Oct-13 | 7 |  |  |  |  |  |  |  |  |  |  |  |  |  |  |  |  |  |  |  |  |  |  |  |  |  |  |  |  |  |  |  |  |  |  |  |  |  |  |  |  |  |  |  |  |  |  |  |  |  |  |
| Nov-13 | 6.6 |  |  |  |  |  |  |  |  |  |  |  |  |  |  |  |  |  |  |  |  |  |  |  |  |  |  |  |  |  |  |  |  |  |  |  |  |  |  |  |  |  |  |  |  |  |  |  |  |  |  |
| Dec-13 | 6.5 |  |  |  |  |  |  |  |  |  |  |  |  |  |  |  |  |  |  |  |  |  |  |  |  |  |  |  |  |  |  |  |  |  |  |  |  |  |  |  |  |  |  |  |  |  |  |  |  |  |  |
| Jan-14 | 7 |  |  |  |  |  |  |  |  |  |  |  |  |  |  |  |  |  |  |  |  |  |  |  |  |  |  |  |  |  |  |  |  |  |  |  |  |  |  |  |  |  |  |  |  |  |  |  |  |  |  |
| Feb-14 | 7 |  |  |  |  |  |  |  |  |  |  |  |  |  |  |  |  |  |  |  |  |  |  |  |  |  |  |  |  |  |  |  |  |  |  |  |  |  |  |  |  |  |  |  |  |  |  |  |  |  |  |
| Mar-14 | 6.8 |  |  |  |  |  |  |  |  |  |  |  |  |  |  |  |  |  |  |  |  |  |  |  |  |  |  |  |  |  |  |  |  |  |  |  |  |  |  |  |  |  |  |  |  |  |  |  |  |  |  |
| Apr-14 | 5.9 |  |  |  |  |  |  |  |  |  |  |  |  |  |  |  |  |  |  |  |  |  |  |  |  |  |  |  |  |  |  |  |  |  |  |  |  |  |  |  |  |  |  |  |  |  |  |  |  |  |  |
| May-14 | 6.1 |  |  |  |  |  |  |  |  |  |  |  |  |  |  |  |  |  |  |  |  |  |  |  |  |  |  |  |  |  |  |  |  |  |  |  |  |  |  |  |  |  |  |  |  |  |  |  |  |  |  |
| Jun-14 | 6.3 |  |  |  |  |  |  |  |  |  |  |  |  |  |  |  |  |  |  |  |  |  |  |  |  |  |  |  |  |  |  |  |  |  |  |  |  |  |  |  |  |  |  |  |  |  |  |  |  |  |  |
| Jul-14 | 6.5 |  |  |  |  |  |  |  |  |  |  |  |  |  |  |  |  |  |  |  |  |  |  |  |  |  |  |  |  |  |  |  |  |  |  |  |  |  |  |  |  |  |  |  |  |  |  |  |  |  |  |
| Aug-14 | 6.3 |  |  |  |  |  |  |  |  |  |  |  |  |  |  |  |  |  |  |  |  |  |  |  |  |  |  |  |  |  |  |  |  |  |  |  |  |  |  |  |  |  |  |  |  |  |  |  |  |  |  |
| Sep-14 | 5.7 |  |  |  |  |  |  |  |  |  |  |  |  |  |  |  |  |  |  |  |  |  |  |  |  |  |  |  |  |  |  |  |  |  |  |  |  |  |  |  |  |  |  |  |  |  |  |  |  |  |  |
| Oct-14 | 5.5 |  |  |  |  |  |  |  |  |  |  |  |  |  |  |  |  |  |  |  |  |  |  |  |  |  |  |  |  |  |  |  |  |  |  |  |  |  |  |  |  |  |  |  |  |  |  |  |  |  |  |
| Nov-14 | 5.5 |  |  |  |  |  |  |  |  |  |  |  |  |  |  |  |  |  |  |  |  |  |  |  |  |  |  |  |  |  |  |  |  |  |  |  |  |  |  |  |  |  |  |  |  |  |  |  |  |  |  |
| Dec-14 | 5.4 |  |  |  |  |  |  |  |  |  |  |  |  |  |  |  |  |  |  |  |  |  |  |  |  |  |  |  |  |  |  |  |  |  |  |  |  |  |  |  |  |  |  |  |  |  |  |  |  |  |  |
| Jan-15 | 6.1 |  |  |  |  |  |  |  |  |  |  |  |  |  |  |  |  |  |  |  |  |  |  |  |  |  |  |  |  |  |  |  |  |  |  |  |  |  |  |  |  |  |  |  |  |  |  |  |  |  |  |
| Feb-15 | 5.8 |  |  |  |  |  |  |  |  |  |  |  |  |  |  |  |  |  |  |  |  |  |  |  |  |  |  |  |  |  |  |  |  |  |  |  |  |  |  |  |  |  |  |  |  |  |  |  |  |  |  |
| Mar-15 | 5.6 |  |  |  |  |  |  |  |  |  |  |  |  |  |  |  |  |  |  |  |  |  |  |  |  |  |  |  |  |  |  |  |  |  |  |  |  |  |  |  |  |  |  |  |  |  |  |  |  |  |  |
| Apr-15 | 5.1 |  |  |  |  |  |  |  |  |  |  |  |  |  |  |  |  |  |  |  |  |  |  |  |  |  |  |  |  |  |  |  |  |  |  |  |  |  |  |  |  |  |  |  |  |  |  |  |  |  |  |
| May-15 | 5.3 |  |  |  |  |  |  |  |  |  |  |  |  |  |  |  |  |  |  |  |  |  |  |  |  |  |  |  |  |  |  |  |  |  |  |  |  |  |  |  |  |  |  |  |  |  |  |  |  |  |  |
| Jun-15 | 5.5 |  |  |  |  |  |  |  |  |  |  |  |  |  |  |  |  |  |  |  |  |  |  |  |  |  |  |  |  |  |  |  |  |  |  |  |  |  |  |  |  |  |  |  |  |  |  |  |  |  |  |
| Jul-15 | 5.6 |  |  |  |  |  |  |  |  |  |  |  |  |  |  |  |  |  |  |  |  |  |  |  |  |  |  |  |  |  |  |  |  |  |  |  |  |  |  |  |  |  |  |  |  |  |  |  |  |  |  |
| Aug-15 | 5.2 |  |  |  |  |  |  |  |  |  |  |  |  |  |  |  |  |  |  |  |  |  |  |  |  |  |  |  |  |  |  |  |  |  |  |  |  |  |  |  |  |  |  |  |  |  |  |  |  |  |  |
| Sep-15 | 4.9 |  |  |  |  |  |  |  |  |  |  |  |  |  |  |  |  |  |  |  |  |  |  |  |  |  |  |  |  |  |  |  |  |  |  |  |  |  |  |  |  |  |  |  |  |  |  |  |  |  |  |
| Oct-15 | 4.8 |  |  |  |  |  |  |  |  |  |  |  |  |  |  |  |  |  |  |  |  |  |  |  |  |  |  |  |  |  |  |  |  |  |  |  |  |  |  |  |  |  |  |  |  |  |  |  |  |  |  |
| Nov-15 | 4.8 |  |  |  |  |  |  |  |  |  |  |  |  |  |  |  |  |  |  |  |  |  |  |  |  |  |  |  |  |  |  |  |  |  |  |  |  |  |  |  |  |  |  |  |  |  |  |  |  |  |  |
| Dec-15 | 4.8 |  |  |  |  |  |  |  |  |  |  |  |  |  |  |  |  |  |  |  |  |  |  |  |  |  |  |  |  |  |  |  |  |  |  |  |  |  |  |  |  |  |  |  |  |  |  |  |  |  |  |
| Jan-16 | 5.3 |  |  |  |  |  |  |  |  |  |  |  |  |  |  |  |  |  |  |  |  |  |  |  |  |  |  |  |  |  |  |  |  |  |  |  |  |  |  |  |  |  |  |  |  |  |  |  |  |  |  |
| Feb-16 | 5.2 |  |  |  |  |  |  |  |  |  |  |  |  |  |  |  |  |  |  |  |  |  |  |  |  |  |  |  |  |  |  |  |  |  |  |  |  |  |  |  |  |  |  |  |  |  |  |  |  |  |  |
| Mar-16 | 5.1 |  |  |  |  |  |  |  |  |  |  |  |  |  |  |  |  |  |  |  |  |  |  |  |  |  |  |  |  |  |  |  |  |  |  |  |  |  |  |  |  |  |  |  |  |  |  |  |  |  |  |
| Apr-16 | 4.7 |  |  |  |  |  |  |  |  |  |  |  |  |  |  |  |  |  |  |  |  |  |  |  |  |  |  |  |  |  |  |  |  |  |  |  |  |  |  |  |  |  |  |  |  |  |  |  |  |  |  |
| May-16 | 4.5 |  |  |  |  |  |  |  |  |  |  |  |  |  |  |  |  |  |  |  |  |  |  |  |  |  |  |  |  |  |  |  |  |  |  |  |  |  |  |  |  |  |  |  |  |  |  |  |  |  |  |
| Jun-16 | 5.1 |  |  |  |  |  |  |  |  |  |  |  |  |  |  |  |  |  |  |  |  |  |  |  |  |  |  |  |  |  |  |  |  |  |  |  |  |  |  |  |  |  |  |  |  |  |  |  |  |  |  |
| Jul-16 | 5.1 |  |  |  |  |  |  |  |  |  |  |  |  |  |  |  |  |  |  |  |  |  |  |  |  |  |  |  |  |  |  |  |  |  |  |  |  |  |  |  |  |  |  |  |  |  |  |  |  |  |  |
| Aug-16 | 5 |  |  |  |  |  |  |  |  |  |  |  |  |  |  |  |  |  |  |  |  |  |  |  |  |  |  |  |  |  |  |  |  |  |  |  |  |  |  |  |  |  |  |  |  |  |  |  |  |  |  |
| Sep-16 | 4.8 |  |  |  |  |  |  |  |  |  |  |  |  |  |  |  |  |  |  |  |  |  |  |  |  |  |  |  |  |  |  |  |  |  |  |  |  |  |  |  |  |  |  |  |  |  |  |  |  |  |  |
| Oct-16 | 4.7 |  |  |  |  |  |  |  |  |  |  |  |  |  |  |  |  |  |  |  |  |  |  |  |  |  |  |  |  |  |  |  |  |  |  |  |  |  |  |  |  |  |  |  |  |  |  |  |  |  |  |
| Nov-16 | 4.4 |  |  |  |  |  |  |  |  |  |  |  |  |  |  |  |  |  |  |  |  |  |  |  |  |  |  |  |  |  |  |  |  |  |  |  |  |  |  |  |  |  |  |  |  |  |  |  |  |  |  |
| Dec-16 | 4.5 |  |  |  |  |  |  |  |  |  |  |  |  |  |  |  |  |  |  |  |  |  |  |  |  |  |  |  |  |  |  |  |  |  |  |  |  |  |  |  |  |  |  |  |  |  |  |  |  |  |  |
| Jan-17 | 5.1 |  |  |  |  |  |  |  |  |  |  |  |  |  |  |  |  |  |  |  |  |  |  |  |  |  |  |  |  |  |  |  |  |  |  |  |  |  |  |  |  |  |  |  |  |  |  |  |  |  |  |
| Feb-17 | 4.9 |  |  |  |  |  |  |  |  |  |  |  |  |  |  |  |  |  |  |  |  |  |  |  |  |  |  |  |  |  |  |  |  |  |  |  |  |  |  |  |  |  |  |  |  |  |  |  |  |  |  |
| Mar-17 | 4.6 |  |  |  |  |  |  |  |  |  |  |  |  |  |  |  |  |  |  |  |  |  |  |  |  |  |  |  |  |  |  |  |  |  |  |  |  |  |  |  |  |  |  |  |  |  |  |  |  |  |  |
| Apr-17 | 4.1 |  |  |  |  |  |  |  |  |  |  |  |  |  |  |  |  |  |  |  |  |  |  |  |  |  |  |  |  |  |  |  |  |  |  |  |  |  |  |  |  |  |  |  |  |  |  |  |  |  |  |
| May-17 | 4.1 |  |  |  |  |  |  |  |  |  |  |  |  |  |  |  |  |  |  |  |  |  |  |  |  |  |  |  |  |  |  |  |  |  |  |  |  |  |  |  |  |  |  |  |  |  |  |  |  |  |  |
| Jun-17 | 4.5 |  |  |  |  |  |  |  |  |  |  |  |  |  |  |  |  |  |  |  |  |  |  |  |  |  |  |  |  |  |  |  |  |  |  |  |  |  |  |  |  |  |  |  |  |  |  |  |  |  |  |
| Jul-17 | 4.6 |  |  |  |  |  |  |  |  |  |  |  |  |  |  |  |  |  |  |  |  |  |  |  |  |  |  |  |  |  |  |  |  |  |  |  |  |  |  |  |  |  |  |  |  |  |  |  |  |  |  |
| Aug-17 | 4.5 |  |  |  |  |  |  |  |  |  |  |  |  |  |  |  |  |  |  |  |  |  |  |  |  |  |  |  |  |  |  |  |  |  |  |  |  |  |  |  |  |  |  |  |  |  |  |  |  |  |  |
| Sep-17 | 4.1 |  |  |  |  |  |  |  |  |  |  |  |  |  |  |  |  |  |  |  |  |  |  |  |  |  |  |  |  |  |  |  |  |  |  |  |  |  |  |  |  |  |  |  |  |  |  |  |  |  |  |
| Oct-17 | 3.9 |  |  |  |  |  |  |  |  |  |  |  |  |  |  |  |  |  |  |  |  |  |  |  |  |  |  |  |  |  |  |  |  |  |  |  |  |  |  |  |  |  |  |  |  |  |  |  |  |  |  |
| Nov-17 | 3.9 |  |  |  |  |  |  |  |  |  |  |  |  |  |  |  |  |  |  |  |  |  |  |  |  |  |  |  |  |  |  |  |  |  |  |  |  |  |  |  |  |  |  |  |  |  |  |  |  |  |  |
| Dec-17 | 3.9 |  |  |  |  |  |  |  |  |  |  |  |  |  |  |  |  |  |  |  |  |  |  |  |  |  |  |  |  |  |  |  |  |  |  |  |  |  |  |  |  |  |  |  |  |  |  |  |  |  |  |
| Jan-18 | 4.5 |  |  |  |  |  |  |  |  |  |  |  |  |  |  |  |  |  |  |  |  |  |  |  |  |  |  |  |  |  |  |  |  |  |  |  |  |  |  |  |  |  |  |  |  |  |  |  |  |  |  |
| Feb-18 | 4.4 |  |  |  |  |  |  |  |  |  |  |  |  |  |  |  |  |  |  |  |  |  |  |  |  |  |  |  |  |  |  |  |  |  |  |  |  |  |  |  |  |  |  |  |  |  |  |  |  |  |  |
| Mar-18 | 4.1 |  |  |  |  |  |  |  |  |  |  |  |  |  |  |  |  |  |  |  |  |  |  |  |  |  |  |  |  |  |  |  |  |  |  |  |  |  |  |  |  |  |  |  |  |  |  |  |  |  |  |
| Apr-18 | 3.7 |  |  |  |  |  |  |  |  |  |  |  |  |  |  |  |  |  |  |  |  |  |  |  |  |  |  |  |  |  |  |  |  |  |  |  |  |  |  |  |  |  |  |  |  |  |  |  |  |  |  |
| May-18 | 3.6 |  |  |  |  |  |  |  |  |  |  |  |  |  |  |  |  |  |  |  |  |  |  |  |  |  |  |  |  |  |  |  |  |  |  |  |  |  |  |  |  |  |  |  |  |  |  |  |  |  |  |
| Jun-18 | 4.2 |  |  |  |  |  |  |  |  |  |  |  |  |  |  |  |  |  |  |  |  |  |  |  |  |  |  |  |  |  |  |  |  |  |  |  |  |  |  |  |  |  |  |  |  |  |  |  |  |  |  |
| Jul-18 | 4.1 |  |  |  |  |  |  |  |  |  |  |  |  |  |  |  |  |  |  |  |  |  |  |  |  |  |  |  |  |  |  |  |  |  |  |  |  |  |  |  |  |  |  |  |  |  |  |  |  |  |  |
| Aug-18 | 3.9 |  |  |  |  |  |  |  |  |  |  |  |  |  |  |  |  |  |  |  |  |  |  |  |  |  |  |  |  |  |  |  |  |  |  |  |  |  |  |  |  |  |  |  |  |  |  |  |  |  |  |
| Sep-18 | 3.6 |  |  |  |  |  |  |  |  |  |  |  |  |  |  |  |  |  |  |  |  |  |  |  |  |  |  |  |  |  |  |  |  |  |  |  |  |  |  |  |  |  |  |  |  |  |  |  |  |  |  |
| Oct-18 | 3.5 |  |  |  |  |  |  |  |  |  |  |  |  |  |  |  |  |  |  |  |  |  |  |  |  |  |  |  |  |  |  |  |  |  |  |  |  |  |  |  |  |  |  |  |  |  |  |  |  |  |  |
| Nov-18 | 3.5 |  |  |  |  |  |  |  |  |  |  |  |  |  |  |  |  |  |  |  |  |  |  |  |  |  |  |  |  |  |  |  |  |  |  |  |  |  |  |  |  |  |  |  |  |  |  |  |  |  |  |
| Dec-18 | 3.7 |  |  |  |  |  |  |  |  |  |  |  |  |  |  |  |  |  |  |  |  |  |  |  |  |  |  |  |  |  |  |  |  |  |  |  |  |  |  |  |  |  |  |  |  |  |  |  |  |  |  |
| Jan-19 | 4.4 |  |  |  |  |  |  |  |  |  |  |  |  |  |  |  |  |  |  |  |  |  |  |  |  |  |  |  |  |  |  |  |  |  |  |  |  |  |  |  |  |  |  |  |  |  |  |  |  |  |  |
| Feb-19 | 4.1 |  |  |  |  |  |  |  |  |  |  |  |  |  |  |  |  |  |  |  |  |  |  |  |  |  |  |  |  |  |  |  |  |  |  |  |  |  |  |  |  |  |  |  |  |  |  |  |  |  |  |
| Mar-19 | 3.9 |  |  |  |  |  |  |  |  |  |  |  |  |  |  |  |  |  |  |  |  |  |  |  |  |  |  |  |  |  |  |  |  |  |  |  |  |  |  |  |  |  |  |  |  |  |  |  |  |  |  |
| Apr-19 | 3.3 |  |  |  |  |  |  |  |  |  |  |  |  |  |  |  |  |  |  |  |  |  |  |  |  |  |  |  |  |  |  |  |  |  |  |  |  |  |  |  |  |  |  |  |  |  |  |  |  |  |  |
| May-19 | 3.4 |  |  |  |  |  |  |  |  |  |  |  |  |  |  |  |  |  |  |  |  |  |  |  |  |  |  |  |  |  |  |  |  |  |  |  |  |  |  |  |  |  |  |  |  |  |  |  |  |  |  |
| Jun-19 | 3.8 |  |  |  |  |  |  |  |  |  |  |  |  |  |  |  |  |  |  |  |  |  |  |  |  |  |  |  |  |  |  |  |  |  |  |  |  |  |  |  |  |  |  |  |  |  |  |  |  |  |  |
| Jul-19 | 4 |  |  |  |  |  |  |  |  |  |  |  |  |  |  |  |  |  |  |  |  |  |  |  |  |  |  |  |  |  |  |  |  |  |  |  |  |  |  |  |  |  |  |  |  |  |  |  |  |  |  |
| Aug-19 | 3.8 |  |  |  |  |  |  |  |  |  |  |  |  |  |  |  |  |  |  |  |  |  |  |  |  |  |  |  |  |  |  |  |  |  |  |  |  |  |  |  |  |  |  |  |  |  |  |  |  |  |  |
| Sep-19 | 3.3 |  |  |  |  |  |  |  |  |  |  |  |  |  |  |  |  |  |  |  |  |  |  |  |  |  |  |  |  |  |  |  |  |  |  |  |  |  |  |  |  |  |  |  |  |  |  |  |  |  |  |
| Oct-19 | 3.3 |  |  |  |  |  |  |  |  |  |  |  |  |  |  |  |  |  |  |  |  |  |  |  |  |  |  |  |  |  |  |  |  |  |  |  |  |  |  |  |  |  |  |  |  |  |  |  |  |  |  |
| Nov-19 | 3.3 |  |  |  |  |  |  |  |  |  |  |  |  |  |  |  |  |  |  |  |  |  |  |  |  |  |  |  |  |  |  |  |  |  |  |  |  |  |  |  |  |  |  |  |  |  |  |  |  |  |  |
| Dec-19 | 3.4 |  |  |  |  |  |  |  |  |  |  |  |  |  |  |  |  |  |  |  |  |  |  |  |  |  |  |  |  |  |  |  |  |  |  |  |  |  |  |  |  |  |  |  |  |  |  |  |  |  |  |
| Jan-20 | 4 |  |  |  |  |  |  |  |  |  |  |  |  |  |  |  |  |  |  |  |  |  |  |  |  |  |  |  |  |  |  |  |  |  |  |  |  |  |  |  |  |  |  |  |  |  |  |  |  |  |  |
| Feb-20 | 3.8 |  |  |  |  |  |  |  |  |  |  |  |  |  |  |  |  |  |  |  |  |  |  |  |  |  |  |  |  |  |  |  |  |  |  |  |  |  |  |  |  |  |  |  |  |  |  |  |  |  |  |
| Mar-20 | 4.5 |  |  |  |  |  |  |  |  |  |  |  |  |  |  |  |  |  |  |  |  |  |  |  |  |  |  |  |  |  |  |  |  |  |  |  |  |  |  |  |  |  |  |  |  |  |  |  |  |  |  |
| Apr-20 | 14.4 |  |  |  |  |  |  |  |  |  |  |  |  |  |  |  |  |  |  |  |  |  |  |  |  |  |  |  |  |  |  |  |  |  |  |  |  |  |  |  |  |  |  |  |  |  |  |  |  |  |  |
| May-20 | 13 |  |  |  |  |  |  |  |  |  |  |  |  |  |  |  |  |  |  |  |  |  |  |  |  |  |  |  |  |  |  |  |  |  |  |  |  |  |  |  |  |  |  |  |  |  |  |  |  |  |  |
| Jun-20 | 11.2 |  |  |  |  |  |  |  |  |  |  |  |  |  |  |  |  |  |  |  |  |  |  |  |  |  |  |  |  |  |  |  |  |  |  |  |  |  |  |  |  |  |  |  |  |  |  |  |  |  |  |
| Jul-20 | 10.5 |  |  |  |  |  |  |  |  |  |  |  |  |  |  |  |  |  |  |  |  |  |  |  |  |  |  |  |  |  |  |  |  |  |  |  |  |  |  |  |  |  |  |  |  |  |  |  |  |  |  |
| Aug-20 | 8.5 |  |  |  |  |  |  |  |  |  |  |  |  |  |  |  |  |  |  |  |  |  |  |  |  |  |  |  |  |  |  |  |  |  |  |  |  |  |  |  |  |  |  |  |  |  |  |  |  |  |  |
| Sep-20 | 7.7 |  |  |  |  |  |  |  |  |  |  |  |  |  |  |  |  |  |  |  |  |  |  |  |  |  |  |  |  |  |  |  |  |  |  |  |  |  |  |  |  |  |  |  |  |  |  |  |  |  |  |
| Oct-20 | 6.6 |  |  |  |  |  |  |  |  |  |  |  |  |  |  |  |  |  |  |  |  |  |  |  |  |  |  |  |  |  |  |  |  |  |  |  |  |  |  |  |  |  |  |  |  |  |  |  |  |  |  |
| Nov-20 | 6.4 |  |  |  |  |  |  |  |  |  |  |  |  |  |  |  |  |  |  |  |  |  |  |  |  |  |  |  |  |  |  |  |  |  |  |  |  |  |  |  |  |  |  |  |  |  |  |  |  |  |  |
| Dec-20 | 6.5 |  |  |  |  |  |  |  |  |  |  |  |  |  |  |  |  |  |  |  |  |  |  |  |  |  |  |  |  |  |  |  |  |  |  |  |  |  |  |  |  |  |  |  |  |  |  |  |  |  |  |
| Jan-21 | 6.8 |  |  |  |  |  |  |  |  |  |  |  |  |  |  |  |  |  |  |  |  |  |  |  |  |  |  |  |  |  |  |  |  |  |  |  |  |  |  |  |  |  |  |  |  |  |  |  |  |  |  |
| Feb-21 | 6.6 |  |  |  |  |  |  |  |  |  |  |  |  |  |  |  |  |  |  |  |  |  |  |  |  |  |  |  |  |  |  |  |  |  |  |  |  |  |  |  |  |  |  |  |  |  |  |  |  |  |  |
| Mar-21 | 6.2 |  |  |  |  |  |  |  |  |  |  |  |  |  |  |  |  |  |  |  |  |  |  |  |  |  |  |  |  |  |  |  |  |  |  |  |  |  |  |  |  |  |  |  |  |  |  |  |  |  |  |
| Apr-21 | 5.7 |  |  |  |  |  |  |  |  |  |  |  |  |  |  |  |  |  |  |  |  |  |  |  |  |  |  |  |  |  |  |  |  |  |  |  |  |  |  |  |  |  |  |  |  |  |  |  |  |  |  |
| May-21 | 5.5 |  |  |  |  |  |  |  |  |  |  |  |  |  |  |  |  |  |  |  |  |  |  |  |  |  |  |  |  |  |  |  |  |  |  |  |  |  |  |  |  |  |  |  |  |  |  |  |  |  |  |
| Jun-21 | 6.1 |  |  |  |  |  |  |  |  |  |  |  |  |  |  |  |  |  |  |  |  |  |  |  |  |  |  |  |  |  |  |  |  |  |  |  |  |  |  |  |  |  |  |  |  |  |  |  |  |  |  |
| Jul-21 | 5.7 |  |  |  |  |  |  |  |  |  |  |  |  |  |  |  |  |  |  |  |  |  |  |  |  |  |  |  |  |  |  |  |  |  |  |  |  |  |  |  |  |  |  |  |  |  |  |  |  |  |  |
| Aug-21 | 5.3 |  |  |  |  |  |  |  |  |  |  |  |  |  |  |  |  |  |  |  |  |  |  |  |  |  |  |  |  |  |  |  |  |  |  |  |  |  |  |  |  |  |  |  |  |  |  |  |  |  |  |
| Sep-21 | 4.6 |  |  |  |  |  |  |  |  |  |  |  |  |  |  |  |  |  |  |  |  |  |  |  |  |  |  |  |  |  |  |  |  |  |  |  |  |  |  |  |  |  |  |  |  |  |  |  |  |  |  |
| Oct-21 | 4.3 |  |  |  |  |  |  |  |  |  |  |  |  |  |  |  |  |  |  |  |  |  |  |  |  |  |  |  |  |  |  |  |  |  |  |  |  |  |  |  |  |  |  |  |  |  |  |  |  |  |  |
| Nov-21 | 3.9 |  |  |  |  |  |  |  |  |  |  |  |  |  |  |  |  |  |  |  |  |  |  |  |  |  |  |  |  |  |  |  |  |  |  |  |  |  |  |  |  |  |  |  |  |  |  |  |  |  |  |
| Dec-21 | 3.7 |  |  |  |  |  |  |  |  |  |  |  |  |  |  |  |  |  |  |  |  |  |  |  |  |  |  |  |  |  |  |  |  |  |  |  |  |  |  |  |  |  |  |  |  |  |  |  |  |  |  |
| Jan-22 | 4.4 |  |  |  |  |  |  |  |  |  |  |  |  |  |  |  |  |  |  |  |  |  |  |  |  |  |  |  |  |  |  |  |  |  |  |  |  |  |  |  |  |  |  |  |  |  |  |  |  |  |  |
| Feb-22 | 4.1 |  |  |  |  |  |  |  |  |  |  |  |  |  |  |  |  |  |  |  |  |  |  |  |  |  |  |  |  |  |  |  |  |  |  |  |  |  |  |  |  |  |  |  |  |  |  |  |  |  |  |
| Mar-22 | 3.8 |  |  |  |  |  |  |  |  |  |  |  |  |  |  |  |  |  |  |  |  |  |  |  |  |  |  |  |  |  |  |  |  |  |  |  |  |  |  |  |  |  |  |  |  |  |  |  |  |  |  |
| Apr-22 | 3.3 |  |  |  |  |  |  |  |  |  |  |  |  |  |  |  |  |  |  |  |  |  |  |  |  |  |  |  |  |  |  |  |  |  |  |  |  |  |  |  |  |  |  |  |  |  |  |  |  |  |  |
| May-22 | 3.4 |  |  |  |  |  |  |  |  |  |  |  |  |  |  |  |  |  |  |  |  |  |  |  |  |  |  |  |  |  |  |  |  |  |  |  |  |  |  |  |  |  |  |  |  |  |  |  |  |  |  |
| Jun-22 | 3.8 |  |  |  |  |  |  |  |  |  |  |  |  |  |  |  |  |  |  |  |  |  |  |  |  |  |  |  |  |  |  |  |  |  |  |  |  |  |  |  |  |  |  |  |  |  |  |  |  |  |  |
| Jul-22 | 3.8 |  |  |  |  |  |  |  |  |  |  |  |  |  |  |  |  |  |  |  |  |  |  |  |  |  |  |  |  |  |  |  |  |  |  |  |  |  |  |  |  |  |  |  |  |  |  |  |  |  |  |
| Aug-22 | 3.8 |  |  |  |  |  |  |  |  |  |  |  |  |  |  |  |  |  |  |  |  |  |  |  |  |  |  |  |  |  |  |  |  |  |  |  |  |  |  |  |  |  |  |  |  |  |  |  |  |  |  |
| Sep-22 | 3.3 |  |  |  |  |  |  |  |  |  |  |  |  |  |  |  |  |  |  |  |  |  |  |  |  |  |  |  |  |  |  |  |  |  |  |  |  |  |  |  |  |  |  |  |  |  |  |  |  |  |  |
| Oct-22 | 3.4 |  |  |  |  |  |  |  |  |  |  |  |  |  |  |  |  |  |  |  |  |  |  |  |  |  |  |  |  |  |  |  |  |  |  |  |  |  |  |  |  |  |  |  |  |  |  |  |  |  |  |
| Nov-22 | 3.4 |  |  |  |  |  |  |  |  |  |  |  |  |  |  |  |  |  |  |  |  |  |  |  |  |  |  |  |  |  |  |  |  |  |  |  |  |  |  |  |  |  |  |  |  |  |  |  |  |  |  |
| Dec-22 | 3.3 |  |  |  |  |  |  |  |  |  |  |  |  |  |  |  |  |  |  |  |  |  |  |  |  |  |  |  |  |  |  |  |  |  |  |  |  |  |  |  |  |  |  |  |  |  |  |  |  |  |  |